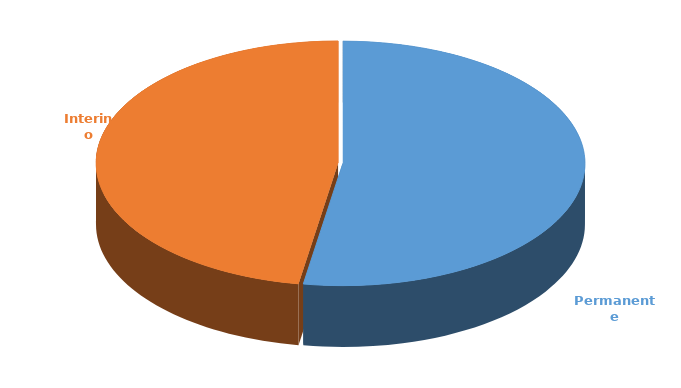
| Category | Cantidad |
|---|---|
| Permanente | 3102 |
| Interino | 2794 |